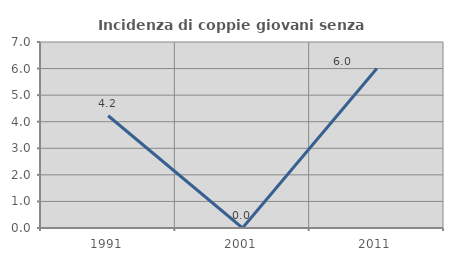
| Category | Incidenza di coppie giovani senza figli |
|---|---|
| 1991.0 | 4.225 |
| 2001.0 | 0 |
| 2011.0 | 6 |